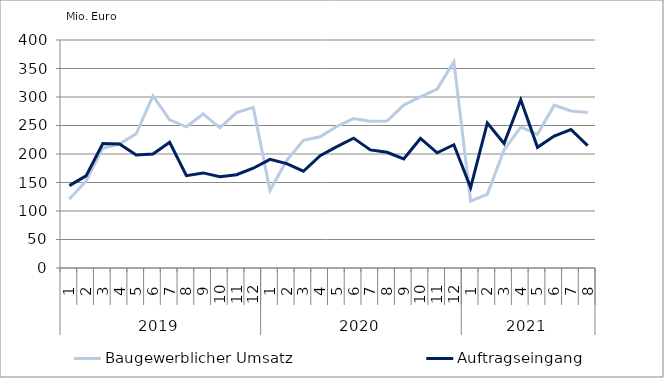
| Category | Baugewerblicher Umsatz | Auftragseingang |
|---|---|---|
| 0 | 120975.133 | 144510.881 |
| 1 | 152329.786 | 161685.201 |
| 2 | 210227.67 | 218455.879 |
| 3 | 217522.321 | 217610.064 |
| 4 | 235490.429 | 198110.439 |
| 5 | 301963.302 | 200012.086 |
| 6 | 259975.317 | 220559.061 |
| 7 | 247779.658 | 162059.723 |
| 8 | 270249.609 | 166829.611 |
| 9 | 245966.91 | 160120.773 |
| 10 | 272620.351 | 163589.389 |
| 11 | 281810.121 | 175051.247 |
| 12 | 136135.432 | 190647.086 |
| 13 | 188682.361 | 183141.14 |
| 14 | 224009.315 | 169770.009 |
| 15 | 230172.252 | 196979.845 |
| 16 | 248410.714 | 212955.83 |
| 17 | 262078.128 | 227853.487 |
| 18 | 257360.37 | 207209.188 |
| 19 | 257932.168 | 202976.091 |
| 20 | 285866.269 | 191463.844 |
| 21 | 300164.57 | 227245.467 |
| 22 | 313922.518 | 202060.636 |
| 23 | 362040.738 | 216296.504 |
| 24 | 117421.805 | 141020.655 |
| 25 | 129162.55 | 254416.876 |
| 26 | 207280.837 | 218451.405 |
| 27 | 247094.279 | 295077.868 |
| 28 | 234515.312 | 211696.129 |
| 29 | 285732.845 | 231455.155 |
| 30 | 275480.885 | 242932.505 |
| 31 | 272787.524 | 214636.944 |